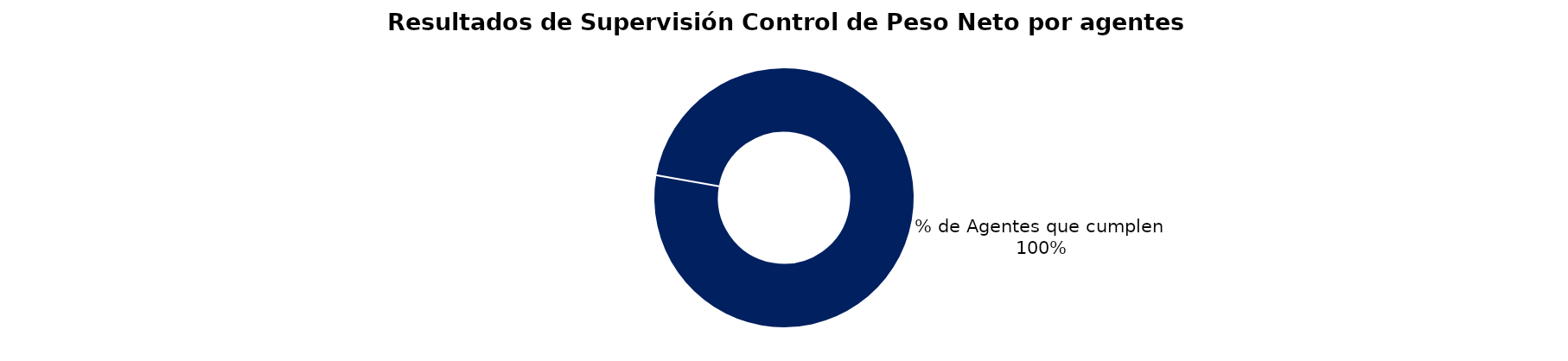
| Category | Series 0 |
|---|---|
| % de Agentes que no cumplen | 0 |
| % de Agentes que cumplen | 34 |